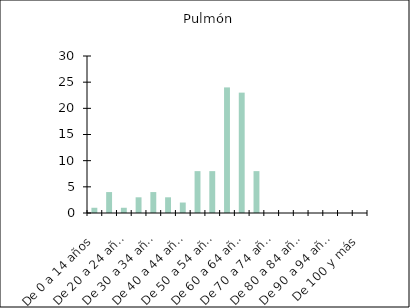
| Category | Pulmón |
|---|---|
| De 0 a 14 años | 1 |
| De 15 a 19 años | 4 |
| De 20 a 24 años | 1 |
| De 25 a 29 años | 3 |
| De 30 a 34 años | 4 |
| De 35 a 39 años | 3 |
| De 40 a 44 años | 2 |
| De 45 a 49 años | 8 |
| De 50 a 54 años | 8 |
| De 55 a 59 años | 24 |
| De 60 a 64 años | 23 |
| De 65 a 69 años | 8 |
| De 70 a 74 años | 0 |
| De 75 a 79 años | 0 |
| De 80 a 84 años | 0 |
| De 85 a 89 años | 0 |
| De 90 a 94 años | 0 |
| De 95 a 99 años | 0 |
| De 100 y más | 0 |